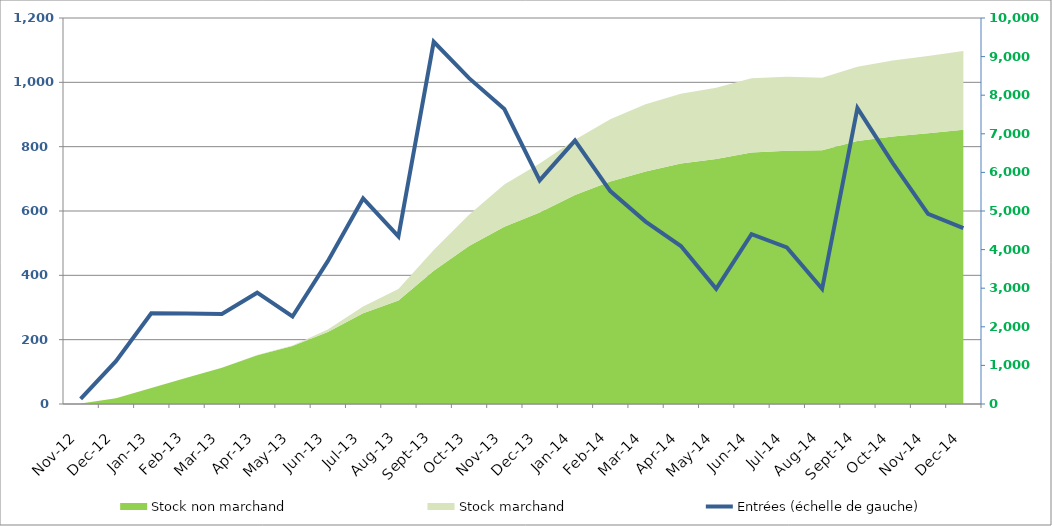
| Category | Entrées (échelle de gauche) |
|---|---|
| 2012-11-01 | 16 |
| 2012-12-01 | 133 |
| 2013-01-01 | 282 |
| 2013-02-01 | 281 |
| 2013-03-01 | 280 |
| 2013-04-01 | 346 |
| 2013-05-01 | 272 |
| 2013-06-01 | 444 |
| 2013-07-01 | 639 |
| 2013-08-01 | 521 |
| 2013-09-01 | 1126 |
| 2013-10-01 | 1013 |
| 2013-11-01 | 917 |
| 2013-12-01 | 695 |
| 2014-01-01 | 819 |
| 2014-02-01 | 662 |
| 2014-03-01 | 567 |
| 2014-04-01 | 491 |
| 2014-05-01 | 358 |
| 2014-06-01 | 528 |
| 2014-07-01 | 487 |
| 2014-08-01 | 358 |
| 2014-09-01 | 920 |
| 2014-10-01 | 749 |
| 2014-11-01 | 591 |
| 2014-12-01 | 547 |